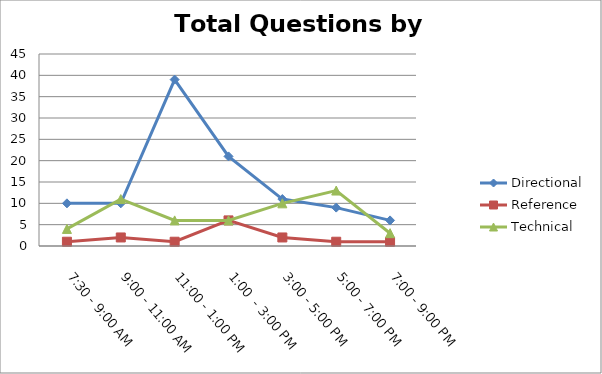
| Category | Directional | Reference | Technical |
|---|---|---|---|
| 7:30 - 9:00 AM | 10 | 1 | 4 |
| 9:00 - 11:00 AM | 10 | 2 | 11 |
| 11:00 - 1:00 PM | 39 | 1 | 6 |
| 1:00  - 3:00 PM | 21 | 6 | 6 |
| 3:00 - 5:00 PM | 11 | 2 | 10 |
| 5:00 - 7:00 PM | 9 | 1 | 13 |
| 7:00 - 9:00 PM | 6 | 1 | 3 |